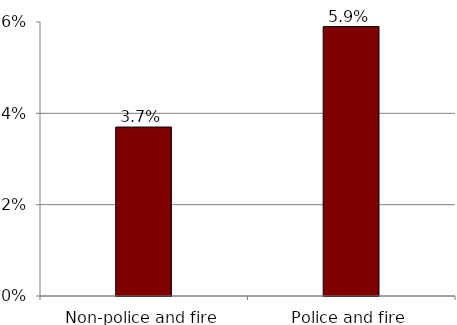
| Category | Series 0 |
|---|---|
| Non-police and fire | 0.037 |
| Police and fire | 0.059 |